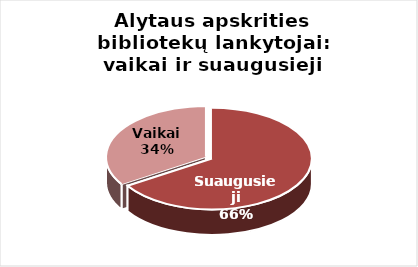
| Category | Series 0 |
|---|---|
| Suaugusieji | 351586 |
| Vaikai | 181113 |